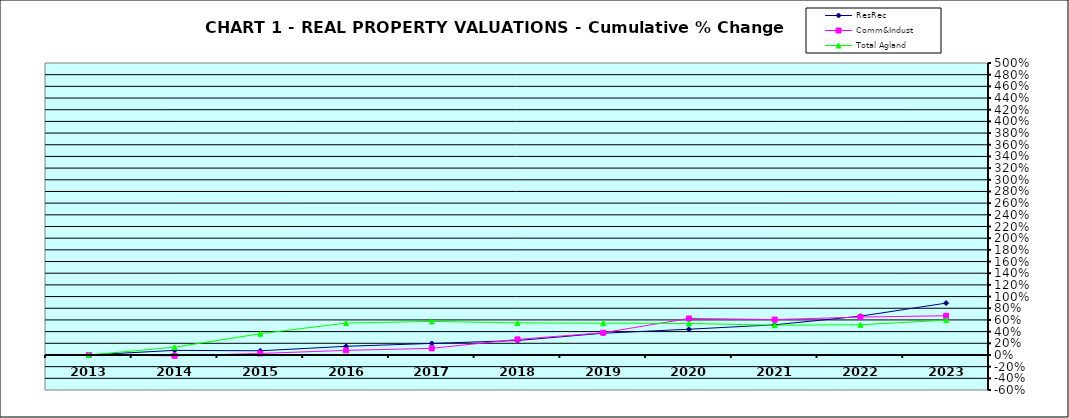
| Category | ResRec | Comm&Indust | Total Agland |
|---|---|---|---|
| 2013.0 | 0 | 0 | 0 |
| 2014.0 | 0.079 | -0.015 | 0.133 |
| 2015.0 | 0.072 | 0.025 | 0.364 |
| 2016.0 | 0.148 | 0.079 | 0.546 |
| 2017.0 | 0.198 | 0.113 | 0.575 |
| 2018.0 | 0.248 | 0.267 | 0.55 |
| 2019.0 | 0.373 | 0.381 | 0.545 |
| 2020.0 | 0.441 | 0.625 | 0.54 |
| 2021.0 | 0.517 | 0.606 | 0.509 |
| 2022.0 | 0.664 | 0.649 | 0.517 |
| 2023.0 | 0.888 | 0.672 | 0.597 |